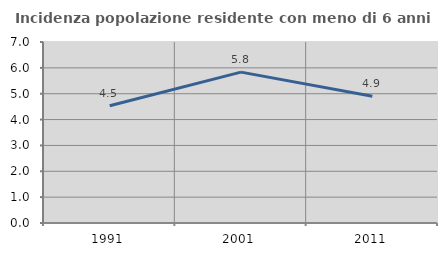
| Category | Incidenza popolazione residente con meno di 6 anni |
|---|---|
| 1991.0 | 4.533 |
| 2001.0 | 5.836 |
| 2011.0 | 4.903 |